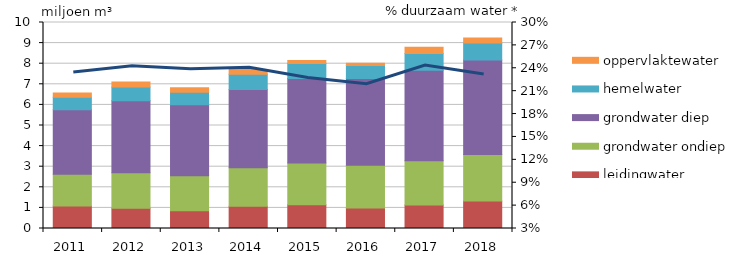
| Category | leidingwater | grondwater ondiep | grondwater diep | hemelwater | oppervlaktewater |
|---|---|---|---|---|---|
| 2011.0 | 1090694.487 | 1541828.213 | 3130378.493 | 610256.548 | 201625.819 |
| 2012.0 | 977763.518 | 1723185.41 | 3498588.561 | 665510.859 | 250076.581 |
| 2013.0 | 860854.753 | 1698036.642 | 3447528.94 | 613702.825 | 211300.74 |
| 2014.0 | 1080091.601 | 1870584.292 | 3797852.956 | 737172.129 | 229198.211 |
| 2015.0 | 1157832.079 | 2022023.818 | 4105321.084 | 725138.531 | 146104.297 |
| 2016.0 | 990413.616 | 2076068.826 | 4215048.828 | 633990.137 | 106708.125 |
| 2017.0 | 1136573.106 | 2158272.849 | 4381947.905 | 823245.457 | 303406.119 |
| 2018.0 | 1336058.375 | 2259550.923 | 4587573.086 | 820833.2 | 238744.953 |